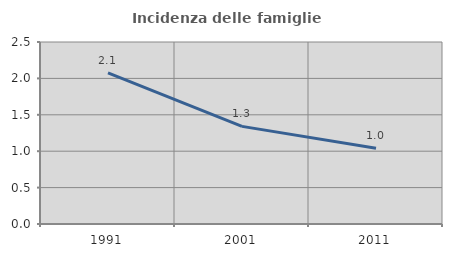
| Category | Incidenza delle famiglie numerose |
|---|---|
| 1991.0 | 2.076 |
| 2001.0 | 1.341 |
| 2011.0 | 1.04 |